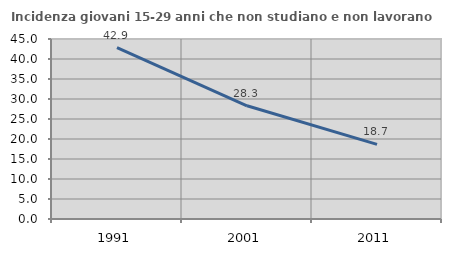
| Category | Incidenza giovani 15-29 anni che non studiano e non lavorano  |
|---|---|
| 1991.0 | 42.857 |
| 2001.0 | 28.302 |
| 2011.0 | 18.662 |